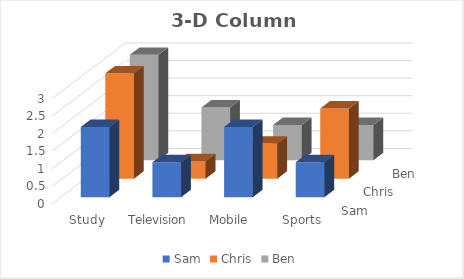
| Category | Sam | Chris | Ben |
|---|---|---|---|
| Study | 2 | 3 | 3 |
| Television | 1 | 0.5 | 1.5 |
| Mobile | 2 | 1 | 1 |
| Sports | 1 | 2 | 1 |